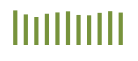
| Category | Saldo [ (1)-(2) ] |
|---|---|
| 0 | 329612.931 |
| 1 | 291358.085 |
| 2 | 266512.131 |
| 3 | 297562.723 |
| 4 | 310243.352 |
| 5 | 320678.349 |
| 6 | 286223.006 |
| 7 | 282809.198 |
| 8 | 306315.684 |
| 9 | 322094.884 |
| 10 | 308889.472 |